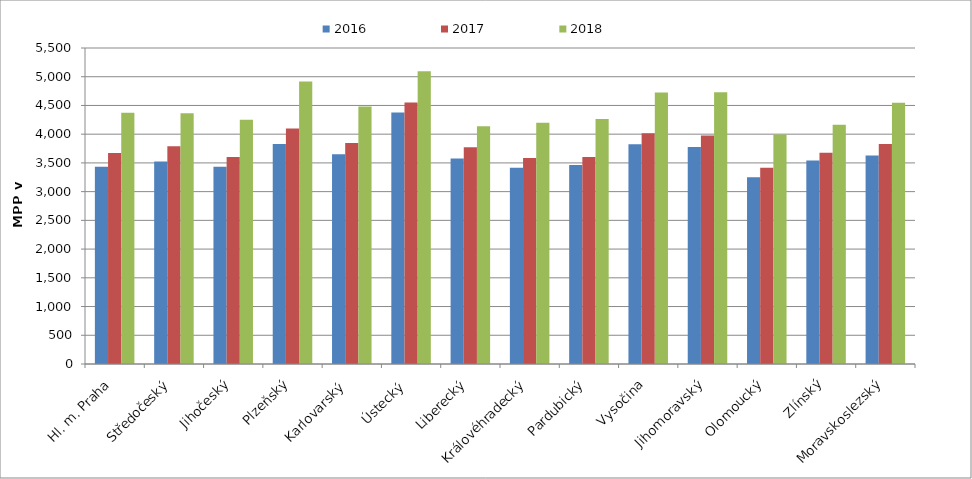
| Category | 2016 | 2017 | 2018 |
|---|---|---|---|
| Hl. m. Praha | 3434.088 | 3674.426 | 4372.642 |
| Středočeský | 3524.73 | 3790.75 | 4363.767 |
| Jihočeský | 3433.071 | 3604.636 | 4249.909 |
| Plzeňský | 3829.684 | 4097.839 | 4917.407 |
| Karlovarský  | 3651.42 | 3845.056 | 4481.288 |
| Ústecký   | 4376.287 | 4551.326 | 5097.348 |
| Liberecký | 3577.207 | 3773.415 | 4137.076 |
| Královéhradecký | 3416.598 | 3587.428 | 4197.288 |
| Pardubický | 3465.373 | 3604.095 | 4265.205 |
| Vysočina | 3823.242 | 4017.492 | 4724.619 |
| Jihomoravský | 3775.9 | 3977.15 | 4729.64 |
| Olomoucký | 3252.282 | 3414.921 | 3995.496 |
| Zlínský | 3540.751 | 3678.447 | 4164.632 |
| Moravskoslezský | 3628.658 | 3828.474 | 4545.147 |